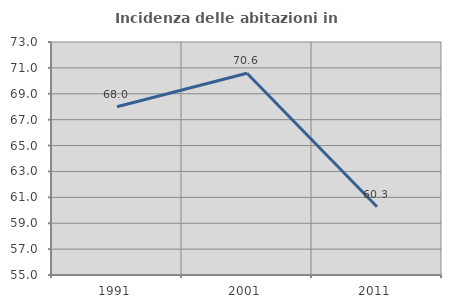
| Category | Incidenza delle abitazioni in proprietà  |
|---|---|
| 1991.0 | 68 |
| 2001.0 | 70.588 |
| 2011.0 | 60.274 |